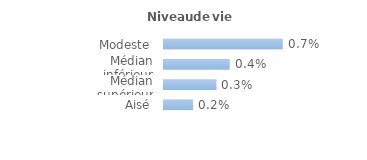
| Category | Series 0 |
|---|---|
| Modeste | 0.007 |
| Médian inférieur | 0.004 |
| Médian supérieur | 0.003 |
| Aisé | 0.002 |